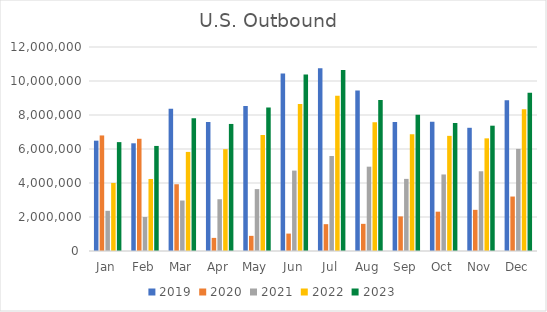
| Category | 2019 | 2020 | 2021 | 2022 | 2023 |
|---|---|---|---|---|---|
| Jan | 6489936.806 | 6797079 | 2363136.892 | 4003868.754 | 6404689.475 |
| Feb | 6335412.593 | 6601177.9 | 2001113.688 | 4237654.314 | 6180041.01 |
| Mar | 8374670.415 | 3926650 | 2968521.7 | 5828838.353 | 7808573.096 |
| Apr | 7592306.487 | 771432 | 3044340.003 | 5989988 | 7473848.495 |
| May | 8529518.996 | 891525.1 | 3639839.17 | 6821987.988 | 8446201.498 |
| Jun | 10444011.047 | 1023999.7 | 4729068.767 | 8644822.767 | 10389665.169 |
| Jul | 10745666.698 | 1578370.1 | 5588570.274 | 9138832.503 | 10645997.359 |
| Aug | 9438441.923 | 1597311.3 | 4959863.705 | 7580261.263 | 8880179.736 |
| Sep | 7593151.729 | 2034545.6 | 4242385.323 | 6867597.273 | 8012116.702 |
| Oct | 7608284.785 | 2313216.3 | 4502048.202 | 6773319.183 | 7534177.427 |
| Nov | 7247525.379 | 2421041.9 | 4689578.329 | 6626364.601 | 7371095.753 |
| Dec | 8871568.78 | 3203915.6 | 6006789.737 | 8333453.206 | 9310641.212 |